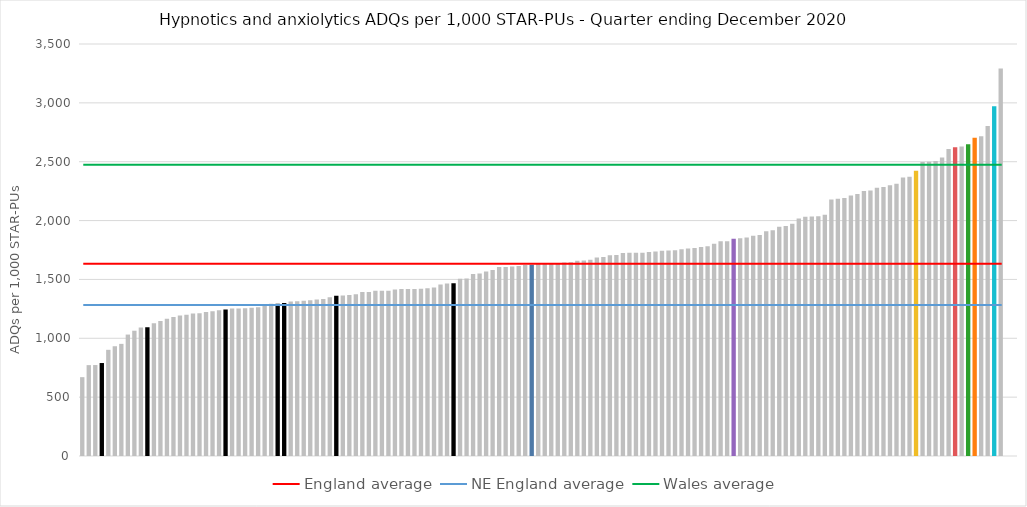
| Category | Series 0 |
|---|---|
| English CCGs | 669.832 |
| English CCGs | 772.039 |
| English CCGs | 772.754 |
| NE England | 789.812 |
| English CCGs | 902.063 |
| English CCGs | 932.483 |
| English CCGs | 952.581 |
| English CCGs | 1031.573 |
| English CCGs | 1064.308 |
| English CCGs | 1090.749 |
| NE England | 1092.785 |
| English CCGs | 1127.048 |
| English CCGs | 1147.594 |
| English CCGs | 1165.441 |
| English CCGs | 1180.71 |
| English CCGs | 1193.305 |
| English CCGs | 1200.594 |
| English CCGs | 1210.963 |
| English CCGs | 1212.821 |
| English CCGs | 1223.259 |
| English CCGs | 1230.483 |
| English CCGs | 1239.08 |
| NE England | 1245.105 |
| English CCGs | 1252.974 |
| English CCGs | 1253.338 |
| English CCGs | 1255.211 |
| English CCGs | 1260.414 |
| English CCGs | 1263.221 |
| English CCGs | 1280.382 |
| English CCGs | 1293.507 |
| NE England | 1293.824 |
| NE England | 1300.048 |
| English CCGs | 1312.13 |
| English CCGs | 1314.314 |
| English CCGs | 1318.356 |
| English CCGs | 1323.613 |
| English CCGs | 1329.988 |
| English CCGs | 1333.303 |
| English CCGs | 1348.923 |
| NE England | 1361.613 |
| English CCGs | 1364.131 |
| English CCGs | 1367.077 |
| English CCGs | 1374.828 |
| English CCGs | 1392.411 |
| English CCGs | 1393.023 |
| English CCGs | 1403.324 |
| English CCGs | 1404.578 |
| English CCGs | 1404.669 |
| English CCGs | 1413.653 |
| English CCGs | 1418.297 |
| English CCGs | 1418.631 |
| English CCGs | 1419.663 |
| English CCGs | 1420.796 |
| English CCGs | 1424.353 |
| English CCGs | 1431.211 |
| English CCGs | 1457.842 |
| English CCGs | 1466.239 |
| NE England | 1467.44 |
| English CCGs | 1506.663 |
| English CCGs | 1508.304 |
| English CCGs | 1545.854 |
| English CCGs | 1549.948 |
| English CCGs | 1566.541 |
| English CCGs | 1579.515 |
| English CCGs | 1605.014 |
| English CCGs | 1605.423 |
| English CCGs | 1609.821 |
| English CCGs | 1614.682 |
| English CCGs | 1623.57 |
| Cardiff and Vale | 1624.994 |
| English CCGs | 1630.545 |
| English CCGs | 1631.97 |
| English CCGs | 1632.173 |
| English CCGs | 1638.195 |
| English CCGs | 1644.593 |
| English CCGs | 1645.664 |
| English CCGs | 1659.588 |
| English CCGs | 1661.135 |
| English CCGs | 1667.23 |
| English CCGs | 1685.688 |
| English CCGs | 1690.354 |
| English CCGs | 1704.72 |
| English CCGs | 1708.148 |
| English CCGs | 1723.683 |
| English CCGs | 1725.861 |
| English CCGs | 1727.012 |
| English CCGs | 1727.502 |
| English CCGs | 1732.039 |
| English CCGs | 1736.456 |
| English CCGs | 1744.008 |
| English CCGs | 1745.633 |
| English CCGs | 1747.297 |
| English CCGs | 1755.498 |
| English CCGs | 1762.479 |
| English CCGs | 1767.426 |
| English CCGs | 1775.158 |
| English CCGs | 1781.586 |
| English CCGs | 1802.706 |
| English CCGs | 1823.609 |
| English CCGs | 1824.415 |
| Powys  | 1845.408 |
| English CCGs | 1848.971 |
| English CCGs | 1856.509 |
| English CCGs | 1871.252 |
| English CCGs | 1877.114 |
| English CCGs | 1910.341 |
| English CCGs | 1918.663 |
| English CCGs | 1946.59 |
| English CCGs | 1954.445 |
| English CCGs | 1973.334 |
| English CCGs | 2017.371 |
| English CCGs | 2032.203 |
| English CCGs | 2034.813 |
| English CCGs | 2035.896 |
| English CCGs | 2049.03 |
| English CCGs | 2179.395 |
| English CCGs | 2185.065 |
| English CCGs | 2192.255 |
| English CCGs | 2213.248 |
| English CCGs | 2226.655 |
| English CCGs | 2252.207 |
| English CCGs | 2254.757 |
| English CCGs | 2279.26 |
| English CCGs | 2284.143 |
| English CCGs | 2299.337 |
| English CCGs | 2312.464 |
| English CCGs | 2365.101 |
| English CCGs | 2373.147 |
| Aneurin Bevan | 2423.191 |
| English CCGs | 2497.877 |
| English CCGs | 2499.493 |
| English CCGs | 2506.515 |
| English CCGs | 2535.152 |
| English CCGs | 2608.395 |
| Hywel Dda | 2623.649 |
| English CCGs | 2629.275 |
| BCU | 2649.187 |
| Swansea Bay UHB | 2702.794 |
| English CCGs | 2716.201 |
| English CCGs | 2802.434 |
| Cwm Taf Morgannwg UHB | 2971.519 |
| English CCGs | 3292.699 |